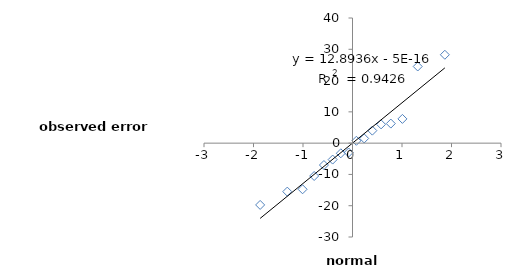
| Category | e |
|---|---|
| -1.8657648402099227 | -19.75 |
| -1.3178098407415364 | -15.5 |
| -1.0082783038771823 | -14.75 |
| -0.7742700563543125 | -10.5 |
| -0.5770936697192589 | -7 |
| -0.4006301257381869 | -5.25 |
| -0.23617194000999964 | -3.25 |
| -0.07805996636699838 | -3 |
| 0.07805996636699838 | 0.75 |
| 0.23617194000999964 | 1.5 |
| 0.4006301257381869 | 4 |
| 0.5770936697192589 | 6 |
| 0.7742700563543125 | 6.25 |
| 1.0082783038771823 | 7.75 |
| 1.3178098407415364 | 24.5 |
| 1.8657648402099227 | 28.25 |